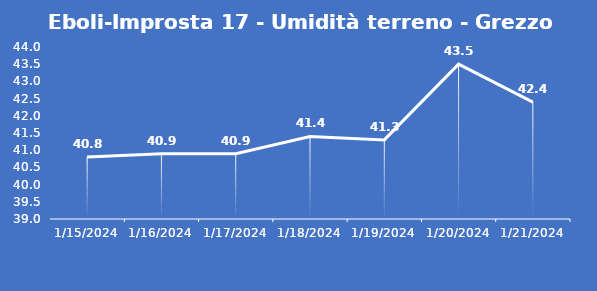
| Category | Eboli-Improsta 17 - Umidità terreno - Grezzo (%VWC) |
|---|---|
| 1/15/24 | 40.8 |
| 1/16/24 | 40.9 |
| 1/17/24 | 40.9 |
| 1/18/24 | 41.4 |
| 1/19/24 | 41.3 |
| 1/20/24 | 43.5 |
| 1/21/24 | 42.4 |